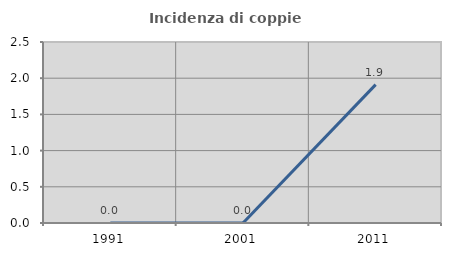
| Category | Incidenza di coppie miste |
|---|---|
| 1991.0 | 0 |
| 2001.0 | 0 |
| 2011.0 | 1.911 |